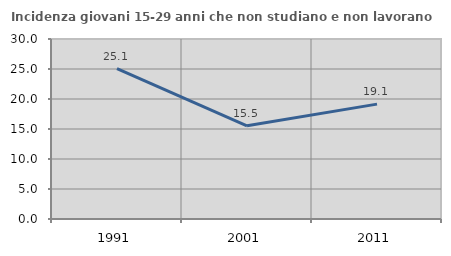
| Category | Incidenza giovani 15-29 anni che non studiano e non lavorano  |
|---|---|
| 1991.0 | 25.055 |
| 2001.0 | 15.527 |
| 2011.0 | 19.143 |